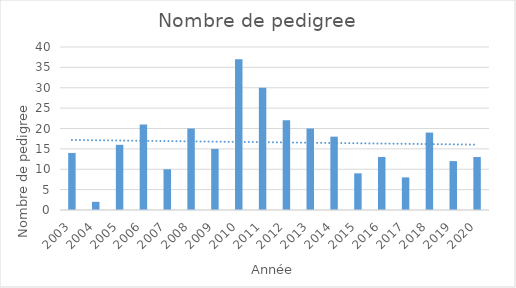
| Category | Series 0 |
|---|---|
| 2003.0 | 14 |
| 2004.0 | 2 |
| 2005.0 | 16 |
| 2006.0 | 21 |
| 2007.0 | 10 |
| 2008.0 | 20 |
| 2009.0 | 15 |
| 2010.0 | 37 |
| 2011.0 | 30 |
| 2012.0 | 22 |
| 2013.0 | 20 |
| 2014.0 | 18 |
| 2015.0 | 9 |
| 2016.0 | 13 |
| 2017.0 | 8 |
| 2018.0 | 19 |
| 2019.0 | 12 |
| 2020.0 | 13 |